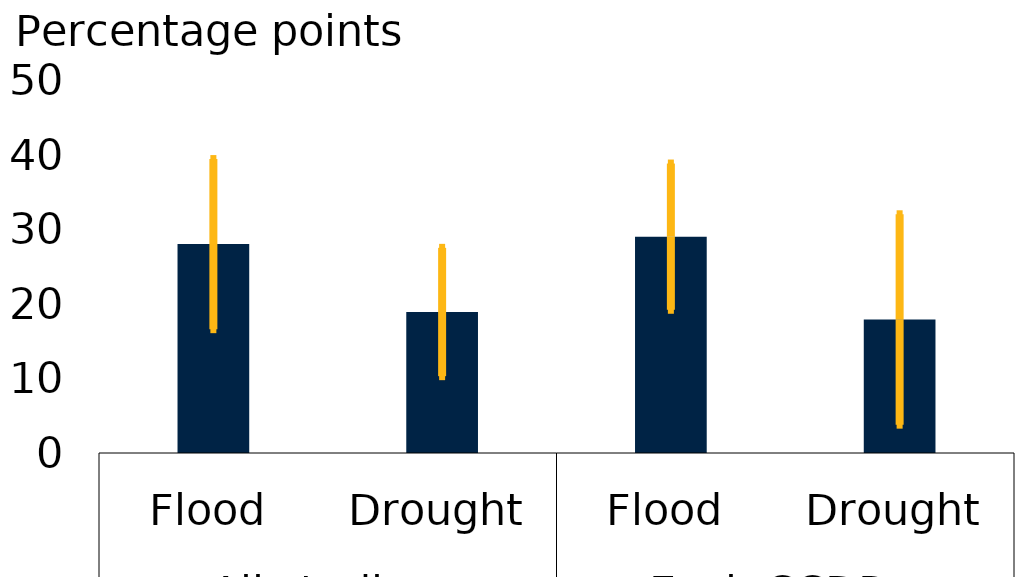
| Category | coefficient estimate |
|---|---|
| 0 | 28 |
| 1 | 18.9 |
| 2 | 29 |
| 3 | 17.9 |